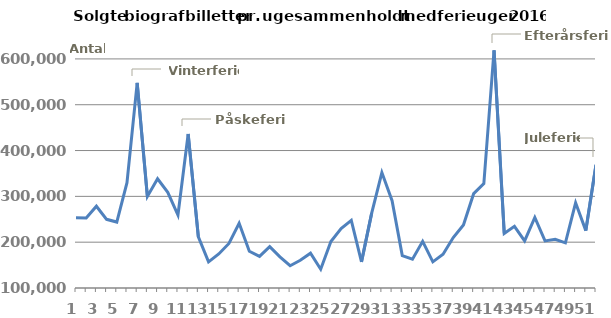
| Category | Series 0 |
|---|---|
| 0 | 253148 |
| 1 | 252863 |
| 2 | 278498 |
| 3 | 249919 |
| 4 | 243900 |
| 5 | 329943 |
| 6 | 547789 |
| 7 | 299878 |
| 8 | 338357 |
| 9 | 308945 |
| 10 | 259203 |
| 11 | 436132 |
| 12 | 211686 |
| 13 | 157025 |
| 14 | 174232 |
| 15 | 197235 |
| 16 | 241100 |
| 17 | 180116 |
| 18 | 168924 |
| 19 | 190306 |
| 20 | 167853 |
| 21 | 148571 |
| 22 | 160546 |
| 23 | 176008 |
| 24 | 140912 |
| 25 | 201507 |
| 26 | 229719 |
| 27 | 247782 |
| 28 | 157083 |
| 29 | 263479 |
| 30 | 352040 |
| 31 | 290438 |
| 32 | 170826 |
| 33 | 162849 |
| 34 | 201858 |
| 35 | 157112 |
| 36 | 173601 |
| 37 | 210122 |
| 38 | 237521 |
| 39 | 305878 |
| 40 | 327971 |
| 41 | 618646 |
| 42 | 219048 |
| 43 | 234664 |
| 44 | 202781 |
| 45 | 254061 |
| 46 | 202678 |
| 47 | 206191 |
| 48 | 198430 |
| 49 | 285931 |
| 50 | 225200 |
| 51 | 368866 |